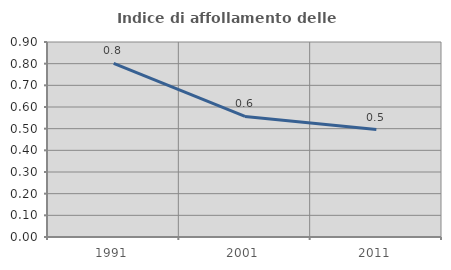
| Category | Indice di affollamento delle abitazioni  |
|---|---|
| 1991.0 | 0.801 |
| 2001.0 | 0.557 |
| 2011.0 | 0.496 |